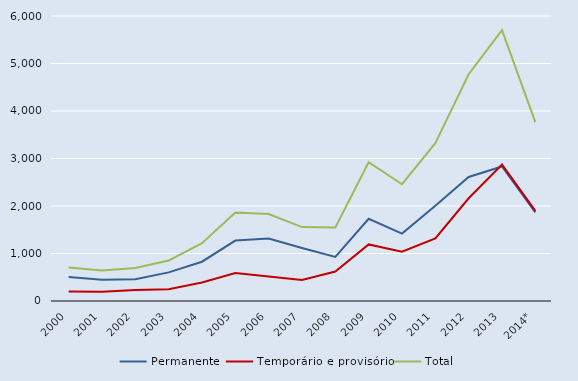
| Category | Permanente | Temporário e provisório | Total |
|---|---|---|---|
| 2000 | 505 | 199 | 704 |
| 2001 | 450 | 194 | 644 |
| 2002 | 459 | 234 | 693 |
| 2003 | 603 | 249 | 852 |
| 2004 | 827 | 390 | 1217 |
| 2005 | 1273 | 589 | 1862 |
| 2006 | 1317 | 514 | 1831 |
| 2007 | 1114 | 442 | 1556 |
| 2008 | 927 | 621 | 1548 |
| 2009 | 1731 | 1191 | 2922 |
| 2010 | 1419 | 1039 | 2458 |
| 2011 | 2006 | 1317 | 3323 |
| 2012 | 2611 | 2163 | 4774 |
| 2013 | 2833 | 2871 | 5704 |
| 2014* | 1866 | 1898 | 3764 |